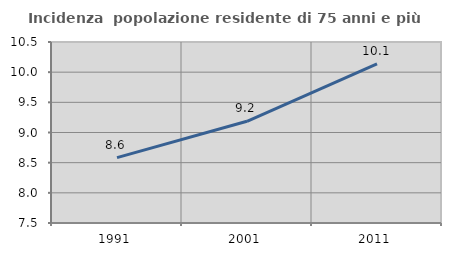
| Category | Incidenza  popolazione residente di 75 anni e più |
|---|---|
| 1991.0 | 8.583 |
| 2001.0 | 9.185 |
| 2011.0 | 10.137 |